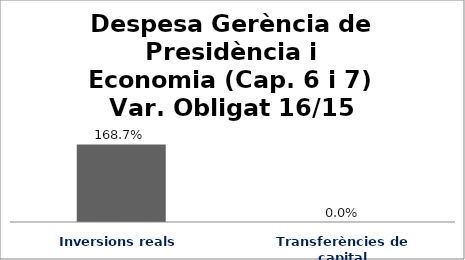
| Category | Series 0 |
|---|---|
| Inversions reals | 1.687 |
| Transferències de capital | 0 |